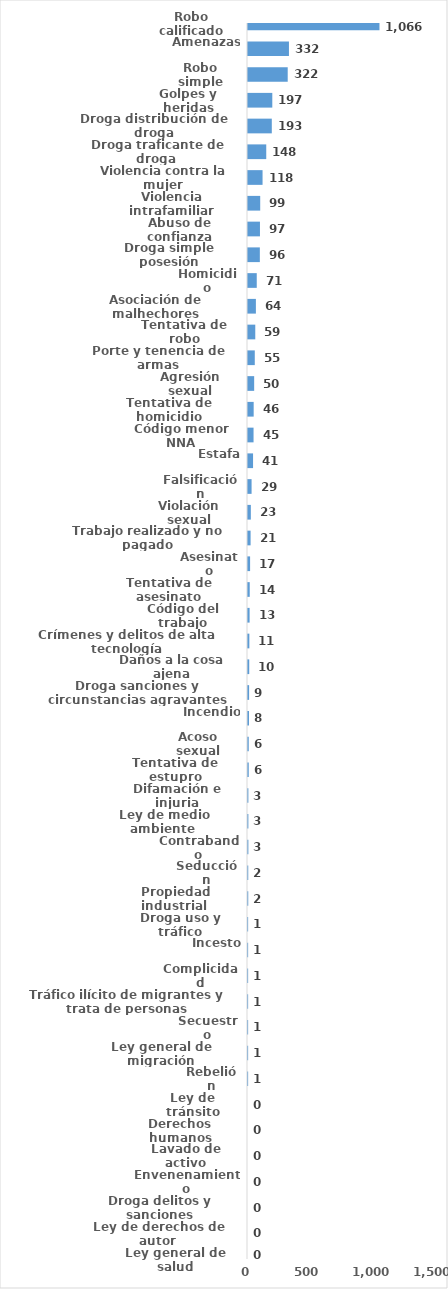
| Category | Series 0 |
|---|---|
| Robo calificado | 1066 |
| Amenazas | 332 |
| Robo simple | 322 |
| Golpes y heridas | 197 |
| Droga distribución de droga | 193 |
| Droga traficante de droga  | 148 |
| Violencia contra la mujer | 118 |
| Violencia intrafamiliar | 99 |
| Abuso de confianza | 97 |
| Droga simple posesión | 96 |
| Homicidio | 71 |
| Asociación de malhechores | 64 |
| Tentativa de robo | 59 |
| Porte y tenencia de armas | 55 |
| Agresión sexual | 50 |
| Tentativa de homicidio | 46 |
| Código menor NNA | 45 |
| Estafa | 41 |
| Falsificación | 29 |
| Violación sexual | 23 |
| Trabajo realizado y no pagado | 21 |
| Asesinato | 17 |
| Tentativa de asesinato | 14 |
| Código del trabajo | 13 |
| Crímenes y delitos de alta tecnología | 11 |
| Daños a la cosa ajena | 10 |
| Droga sanciones y circunstancias agravantes | 9 |
| Incendio | 8 |
| Acoso sexual | 6 |
| Tentativa de estupro | 6 |
| Difamación e injuria | 3 |
| Ley de medio ambiente  | 3 |
| Contrabando | 3 |
| Seducción | 2 |
| Propiedad industrial  | 2 |
| Droga uso y tráfico | 1 |
| Incesto | 1 |
| Complicidad | 1 |
| Tráfico ilícito de migrantes y trata de personas | 1 |
| Secuestro | 1 |
| Ley general de migración | 1 |
| Rebelión | 1 |
| Ley de tránsito | 0 |
| Derechos humanos | 0 |
| Lavado de activo | 0 |
| Envenenamiento | 0 |
| Droga delitos y sanciones | 0 |
| Ley de derechos de autor  | 0 |
| Ley general de salud | 0 |